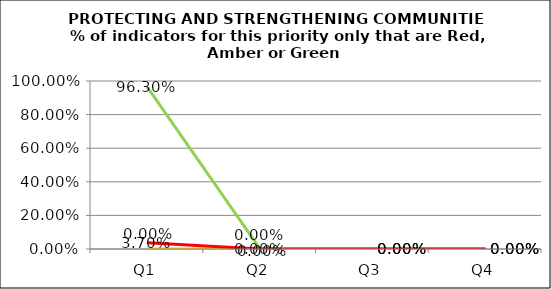
| Category | Green | Amber | Red |
|---|---|---|---|
| Q1 | 0.963 | 0 | 0.037 |
| Q2 | 0 | 0 | 0 |
| Q3 | 0 | 0 | 0 |
| Q4 | 0 | 0 | 0 |